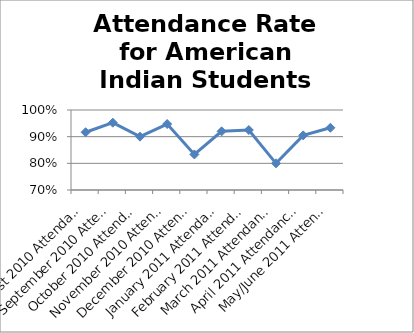
| Category | Attendance Rate forAmerican Indians |
|---|---|
| August 2010 Attendance Rate | 0.917 |
| September 2010 Attendance Rate | 0.952 |
| October 2010 Attendance Rate | 0.9 |
| November 2010 Attendance Rate | 0.947 |
| December 2010 Attendance Rate | 0.833 |
| January 2011 Attendance Rate | 0.92 |
| February 2011 Attendance Rate | 0.925 |
| March 2011 Attendance Rate | 0.8 |
| April 2011 Attendance Rate | 0.905 |
| May/June 2011 Attendance Rate | 0.933 |